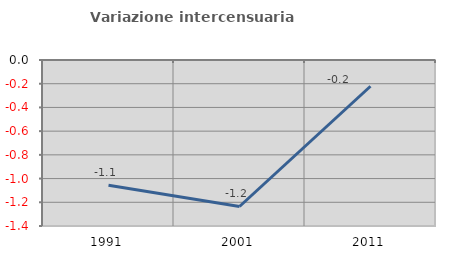
| Category | Variazione intercensuaria annua |
|---|---|
| 1991.0 | -1.056 |
| 2001.0 | -1.235 |
| 2011.0 | -0.221 |